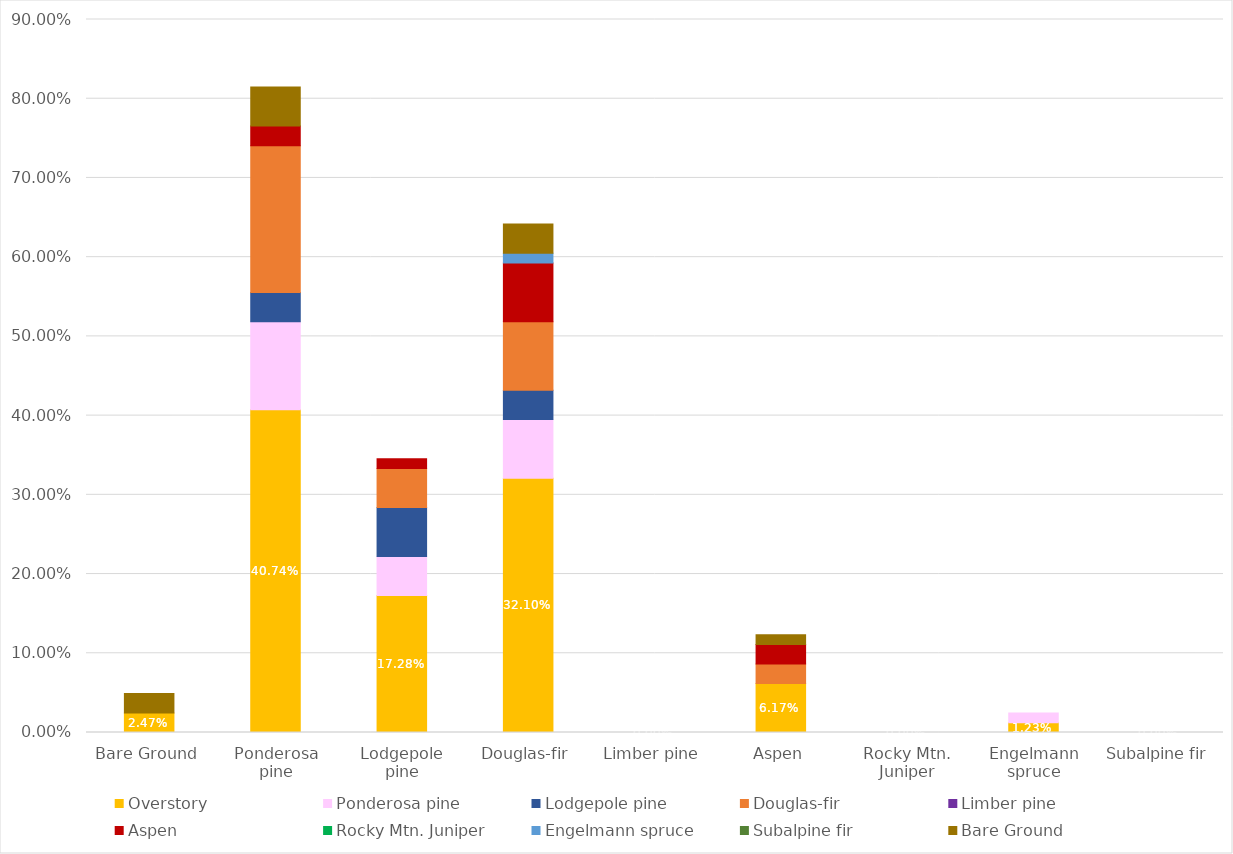
| Category | Overstory | Ponderosa pine | Lodgepole pine | Douglas-fir | Limber pine | Aspen | Rocky Mtn. Juniper | Engelmann spruce | Subalpine fir | Bare Ground |
|---|---|---|---|---|---|---|---|---|---|---|
| Bare Ground | 0.025 | 0 | 0 | 0 | 0 | 0 | 0 | 0 | 0 | 0.025 |
| Ponderosa pine | 0.407 | 0.111 | 0.037 | 0.185 | 0 | 0.025 | 0 | 0 | 0 | 0.049 |
| Lodgepole pine | 0.173 | 0.049 | 0.062 | 0.049 | 0 | 0.012 | 0 | 0 | 0 | 0 |
| Douglas-fir | 0.321 | 0.074 | 0.037 | 0.086 | 0 | 0.074 | 0 | 0.012 | 0 | 0.037 |
| Limber pine | 0 | 0 | 0 | 0 | 0 | 0 | 0 | 0 | 0 | 0 |
| Aspen | 0.062 | 0 | 0 | 0.025 | 0 | 0.025 | 0 | 0 | 0 | 0.012 |
| Rocky Mtn. Juniper | 0 | 0 | 0 | 0 | 0 | 0 | 0 | 0 | 0 | 0 |
| Engelmann spruce | 0.012 | 0.012 | 0 | 0 | 0 | 0 | 0 | 0 | 0 | 0 |
| Subalpine fir | 0 | 0 | 0 | 0 | 0 | 0 | 0 | 0 | 0 | 0 |